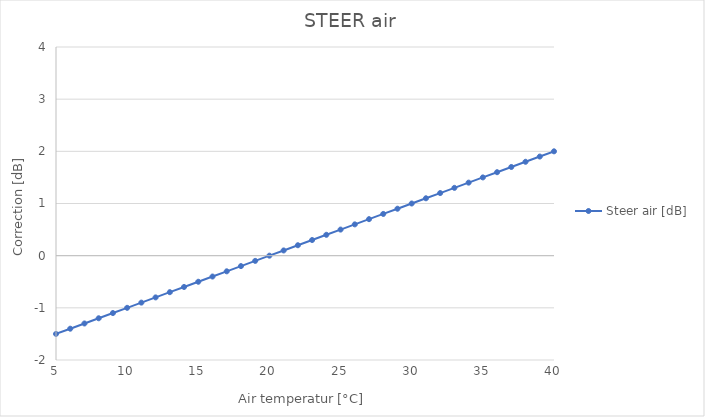
| Category | Steer air [dB] |
|---|---|
| 5.0 | -1.5 |
| 6.0 | -1.4 |
| 7.0 | -1.3 |
| 8.0 | -1.2 |
| 9.0 | -1.1 |
| 10.0 | -1 |
| 11.0 | -0.9 |
| 12.0 | -0.8 |
| 13.0 | -0.7 |
| 14.0 | -0.6 |
| 15.0 | -0.5 |
| 16.0 | -0.4 |
| 17.0 | -0.3 |
| 18.0 | -0.2 |
| 19.0 | -0.1 |
| 20.0 | 0 |
| 21.0 | 0.1 |
| 22.0 | 0.2 |
| 23.0 | 0.3 |
| 24.0 | 0.4 |
| 25.0 | 0.5 |
| 26.0 | 0.6 |
| 27.0 | 0.7 |
| 28.0 | 0.8 |
| 29.0 | 0.9 |
| 30.0 | 1 |
| 31.0 | 1.1 |
| 32.0 | 1.2 |
| 33.0 | 1.3 |
| 34.0 | 1.4 |
| 35.0 | 1.5 |
| 36.0 | 1.6 |
| 37.0 | 1.7 |
| 38.0 | 1.8 |
| 39.0 | 1.9 |
| 40.0 | 2 |
| 41.0 | 2.1 |
| 42.0 | 2.2 |
| 43.0 | 2.3 |
| 44.0 | 2.4 |
| 45.0 | 2.5 |
| 46.0 | 2.6 |
| 47.0 | 2.7 |
| 48.0 | 2.8 |
| 49.0 | 2.9 |
| 50.0 | 3 |